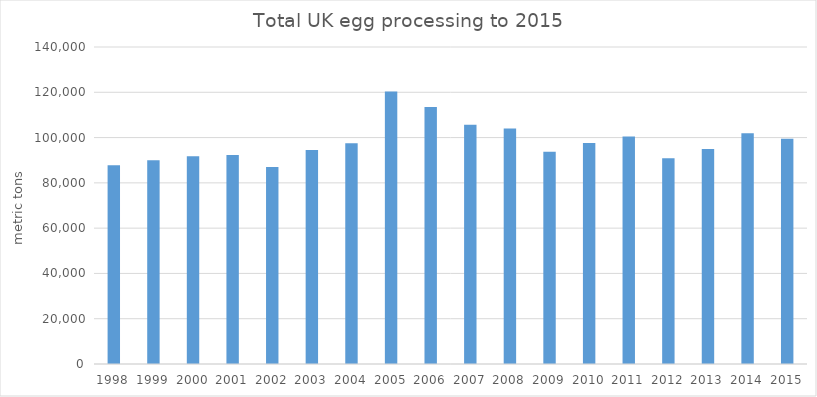
| Category | Series 0 |
|---|---|
| 1998.0 | 87773.302 |
| 1999.0 | 89949.594 |
| 2000.0 | 91777.54 |
| 2001.0 | 92248.42 |
| 2002.0 | 86981.083 |
| 2003.0 | 94495.681 |
| 2004.0 | 97506.135 |
| 2005.0 | 120345.42 |
| 2006.0 | 113513.983 |
| 2007.0 | 105619.055 |
| 2008.0 | 103991.398 |
| 2009.0 | 93724.107 |
| 2010.0 | 97647.623 |
| 2011.0 | 100425.803 |
| 2012.0 | 90840.512 |
| 2013.0 | 95005.248 |
| 2014.0 | 101878.041 |
| 2015.0 | 99473.751 |